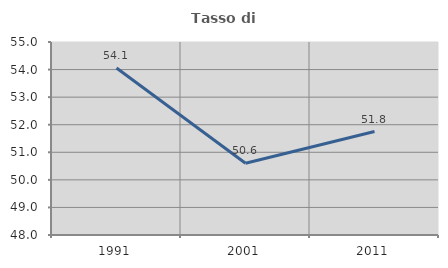
| Category | Tasso di occupazione   |
|---|---|
| 1991.0 | 54.054 |
| 2001.0 | 50.6 |
| 2011.0 | 51.753 |